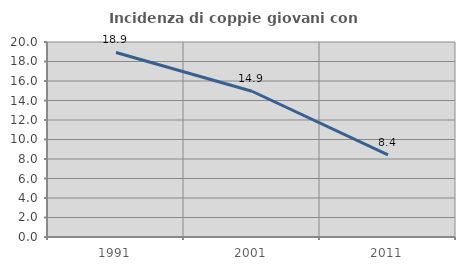
| Category | Incidenza di coppie giovani con figli |
|---|---|
| 1991.0 | 18.927 |
| 2001.0 | 14.95 |
| 2011.0 | 8.431 |